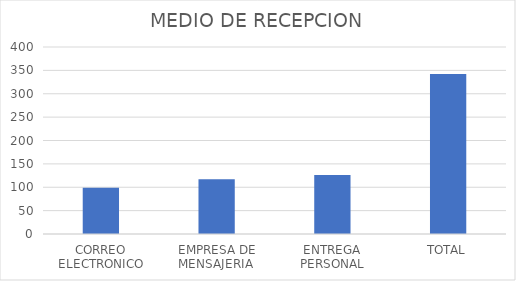
| Category | Series 0 |
|---|---|
| CORREO ELECTRONICO | 99 |
| EMPRESA DE MENSAJERIA  | 117 |
| ENTREGA PERSONAL | 126 |
| TOTAL | 342 |